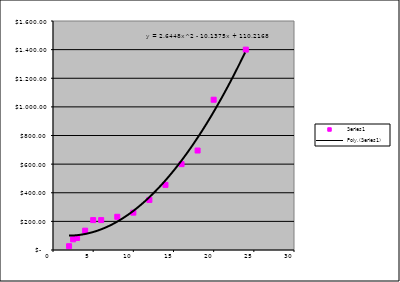
| Category | Series 1 |
|---|---|
| 2.0 | 26.5 |
| 2.5 | 74.5 |
| 3.0 | 84 |
| 4.0 | 135 |
| 5.0 | 209 |
| 6.0 | 209 |
| 8.0 | 232 |
| 10.0 | 261 |
| 12.0 | 350 |
| 14.0 | 455 |
| 16.0 | 600 |
| 18.0 | 695 |
| 20.0 | 1050 |
| 24.0 | 1400 |